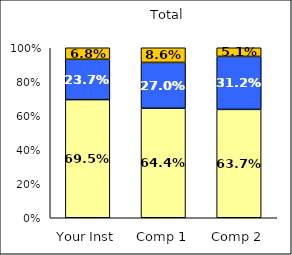
| Category | Low Institutional Priority: Increase Prestige | Average Institutional Priority: Increase Prestige | High Institutional Priority: Increase Prestige |
|---|---|---|---|
| Your Inst | 0.695 | 0.237 | 0.068 |
| Comp 1 | 0.644 | 0.27 | 0.086 |
| Comp 2 | 0.637 | 0.312 | 0.051 |